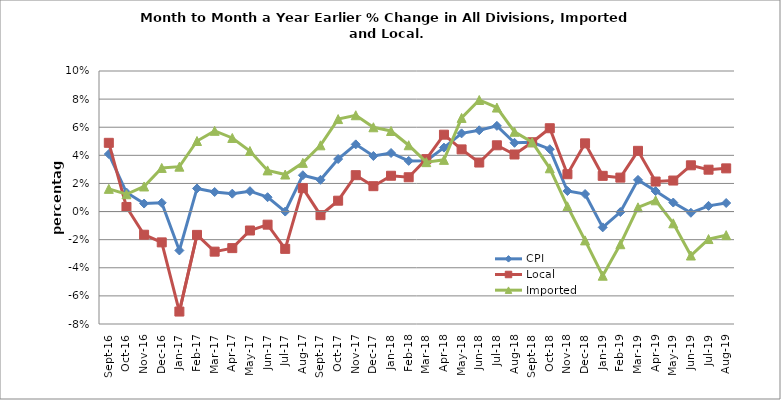
| Category | CPI | Local | Imported |
|---|---|---|---|
| 2016-09-01 | 0.041 | 0.049 | 0.016 |
| 2016-10-01 | 0.014 | 0.003 | 0.012 |
| 2016-11-01 | 0.006 | -0.016 | 0.018 |
| 2016-12-01 | 0.006 | -0.022 | 0.031 |
| 2017-01-01 | -0.028 | -0.071 | 0.032 |
| 2017-02-01 | 0.016 | -0.017 | 0.05 |
| 2017-03-01 | 0.014 | -0.029 | 0.057 |
| 2017-04-01 | 0.013 | -0.026 | 0.052 |
| 2017-05-01 | 0.015 | -0.013 | 0.043 |
| 2017-06-01 | 0.01 | -0.009 | 0.029 |
| 2017-07-01 | 0 | -0.027 | 0.026 |
| 2017-08-01 | 0.026 | 0.017 | 0.035 |
| 2017-09-01 | 0.023 | -0.003 | 0.047 |
| 2017-10-01 | 0.037 | 0.008 | 0.066 |
| 2017-11-01 | 0.048 | 0.026 | 0.069 |
| 2017-12-01 | 0.04 | 0.018 | 0.06 |
| 2018-01-01 | 0.042 | 0.025 | 0.057 |
| 2018-02-01 | 0.036 | 0.024 | 0.047 |
| 2018-03-01 | 0.036 | 0.037 | 0.035 |
| 2018-04-01 | 0.045 | 0.055 | 0.037 |
| 2018-05-01 | 0.056 | 0.044 | 0.067 |
| 2018-06-01 | 0.058 | 0.035 | 0.079 |
| 2018-07-01 | 0.061 | 0.047 | 0.074 |
| 2018-08-01 | 0.049 | 0.041 | 0.057 |
| 2018-09-01 | 0.049 | 0.049 | 0.049 |
| 2018-10-01 | 0.044 | 0.059 | 0.031 |
| 2018-11-01 | 0.015 | 0.027 | 0.004 |
| 2018-12-01 | 0.012 | 0.049 | -0.021 |
| 2019-01-01 | -0.011 | 0.025 | -0.046 |
| 2019-02-01 | 0 | 0.024 | -0.023 |
| 2019-03-01 | 0.023 | 0.043 | 0.003 |
| 2019-04-01 | 0.015 | 0.021 | 0.008 |
| 2019-05-01 | 0.006 | 0.022 | -0.008 |
| 2019-06-01 | -0.001 | 0.033 | -0.031 |
| 2019-07-01 | 0.004 | 0.03 | -0.02 |
| 2019-08-01 | 0.006 | 0.031 | -0.017 |